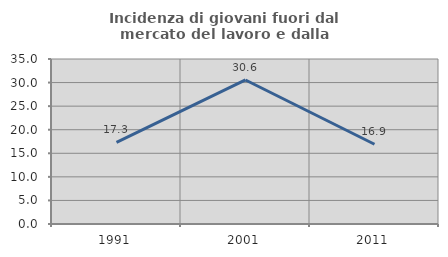
| Category | Incidenza di giovani fuori dal mercato del lavoro e dalla formazione  |
|---|---|
| 1991.0 | 17.308 |
| 2001.0 | 30.551 |
| 2011.0 | 16.922 |